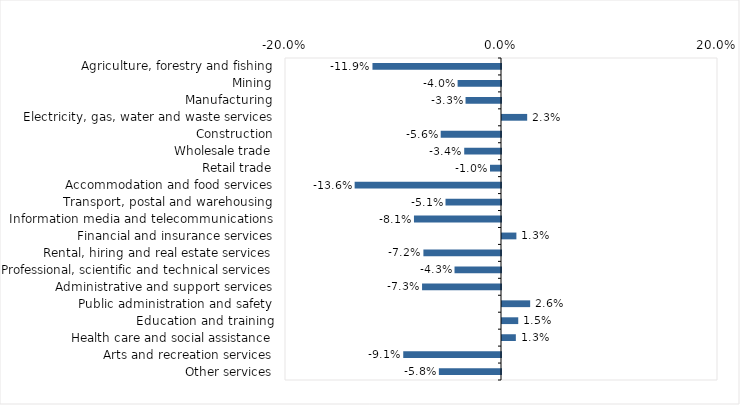
| Category | This week |
|---|---|
| Agriculture, forestry and fishing | -0.119 |
| Mining | -0.04 |
| Manufacturing | -0.033 |
| Electricity, gas, water and waste services | 0.023 |
| Construction | -0.056 |
| Wholesale trade | -0.034 |
| Retail trade | -0.01 |
| Accommodation and food services | -0.136 |
| Transport, postal and warehousing | -0.051 |
| Information media and telecommunications | -0.081 |
| Financial and insurance services | 0.013 |
| Rental, hiring and real estate services | -0.072 |
| Professional, scientific and technical services | -0.043 |
| Administrative and support services | -0.073 |
| Public administration and safety | 0.026 |
| Education and training | 0.015 |
| Health care and social assistance | 0.013 |
| Arts and recreation services | -0.091 |
| Other services | -0.058 |